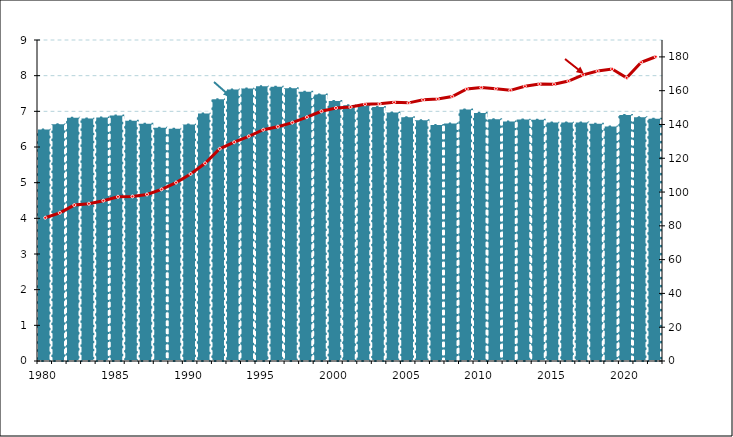
| Category | DIE/PIB |
|---|---|
| 1980 | 6.518 |
| 1981 | 6.668 |
| 1982 | 6.847 |
| 1983 | 6.827 |
| 1984 | 6.854 |
| 1985 | 6.909 |
| 1986 | 6.763 |
| 1987 | 6.678 |
| 1988 | 6.567 |
| 1989 | 6.54 |
| 1990 | 6.661 |
| 1991 | 6.966 |
| 1992 | 7.363 |
| 1993 | 7.639 |
| 1994 | 7.665 |
| 1995 | 7.728 |
| 1996 | 7.718 |
| 1997 | 7.675 |
| 1998 | 7.578 |
| 1999 | 7.503 |
| 2000 | 7.318 |
| 2001 | 7.198 |
| 2002 | 7.2 |
| 2003 | 7.149 |
| 2004 | 6.996 |
| 2005 | 6.865 |
| 2006 | 6.779 |
| 2007 | 6.642 |
| 2008 | 6.685 |
| 2009 | 7.081 |
| 2010 | 6.983 |
| 2011 | 6.806 |
| 2012 | 6.74 |
| 2013 | 6.801 |
| 2014 | 6.794 |
| 2015 | 6.715 |
| 2016 | 6.717 |
| 2017 | 6.714 |
| 2018 | 6.677 |
| 2019 | 6.602 |
| 2020 | 6.926 |
| 2021 | 6.863 |
| 2022p | 6.823 |